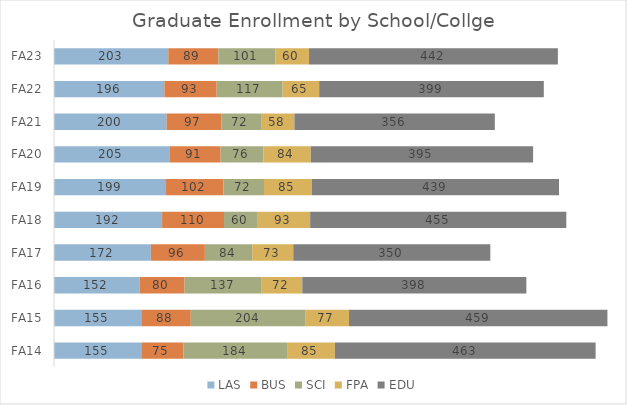
| Category | LAS | BUS | SCI | FPA | EDU |
|---|---|---|---|---|---|
| FA14 | 155 | 75 | 184 | 85 | 463 |
| FA15 | 155 | 88 | 204 | 77 | 459 |
| FA16 | 152 | 80 | 137 | 72 | 398 |
| FA17 | 172 | 96 | 84 | 73 | 350 |
| FA18 | 192 | 110 | 60 | 93 | 455 |
| FA19 | 199 | 102 | 72 | 85 | 439 |
| FA20 | 205 | 91 | 76 | 84 | 395 |
| FA21 | 200 | 97 | 72 | 58 | 356 |
| FA22 | 196 | 93 | 117 | 65 | 399 |
| FA23 | 203 | 89 | 101 | 60 | 442 |